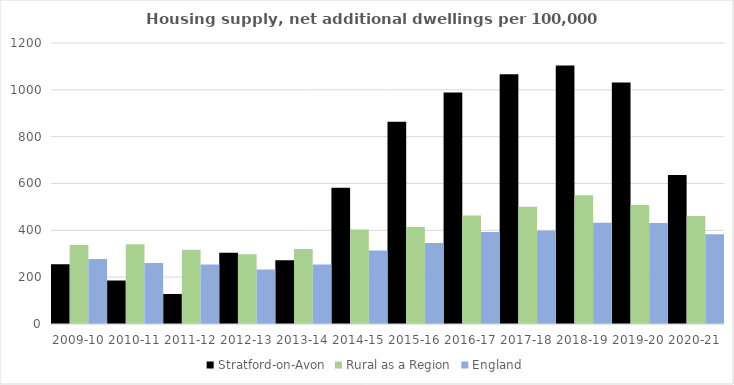
| Category | Stratford-on-Avon | Rural as a Region | England |
|---|---|---|---|
| 2009-10 | 254.703 | 337.852 | 277.548 |
| 2010-11 | 185.704 | 340.105 | 260.994 |
| 2011-12 | 128.286 | 317.04 | 254.007 |
| 2012-13 | 304.651 | 297.763 | 233.153 |
| 2013-14 | 272.158 | 319.835 | 253.602 |
| 2014-15 | 581.381 | 403.796 | 314.256 |
| 2015-16 | 864.111 | 414.091 | 346.154 |
| 2016-17 | 988.285 | 463.209 | 393.256 |
| 2017-18 | 1067.076 | 500.68 | 399.646 |
| 2018-19 | 1103.621 | 549.491 | 432.099 |
| 2019-20 | 1031.53 | 508.493 | 431.187 |
| 2020-21 | 636.697 | 461.114 | 382.827 |